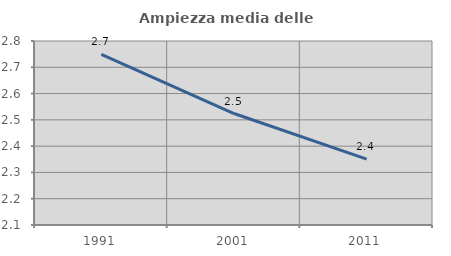
| Category | Ampiezza media delle famiglie |
|---|---|
| 1991.0 | 2.749 |
| 2001.0 | 2.524 |
| 2011.0 | 2.35 |